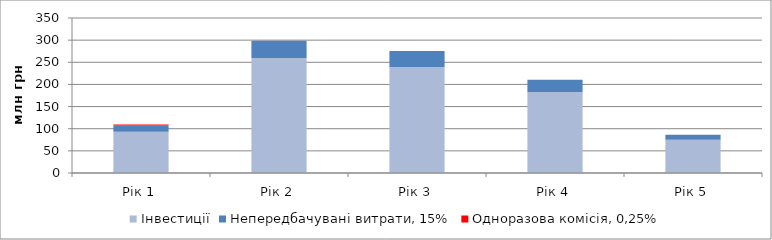
| Category | Інвестиції | Непередбачувані витрати, 15% | Одноразова комісія, 0,25% |
|---|---|---|---|
| Рік 1 | 93.3 | 13.995 | 2.452 |
| Рік 2 | 259.9 | 38.985 | 0 |
| Рік 3 | 239.5 | 35.925 | 0 |
| Рік 4 | 183 | 27.45 | 0 |
| Рік 5 | 75 | 11.25 | 0 |